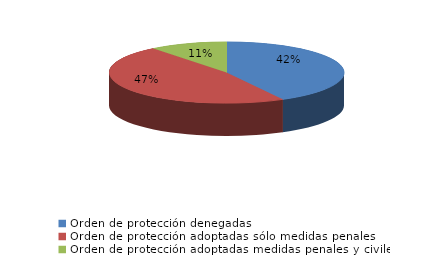
| Category | Series 0 |
|---|---|
| Orden de protección denegadas | 260 |
| Orden de protección adoptadas sólo medidas penales | 292 |
| Orden de protección adoptadas medidas penales y civiles | 66 |